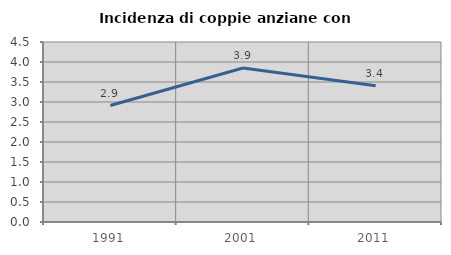
| Category | Incidenza di coppie anziane con figli |
|---|---|
| 1991.0 | 2.912 |
| 2001.0 | 3.852 |
| 2011.0 | 3.406 |